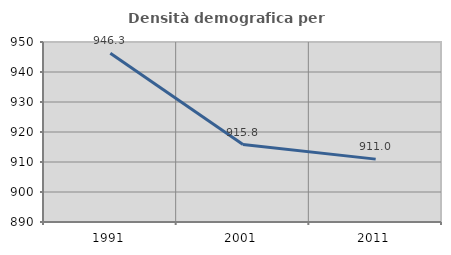
| Category | Densità demografica |
|---|---|
| 1991.0 | 946.274 |
| 2001.0 | 915.814 |
| 2011.0 | 910.956 |